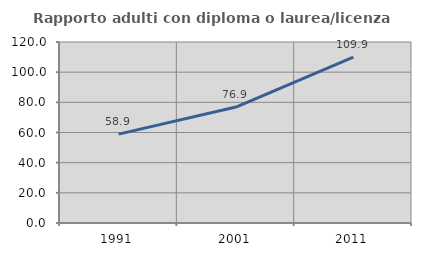
| Category | Rapporto adulti con diploma o laurea/licenza media  |
|---|---|
| 1991.0 | 58.915 |
| 2001.0 | 76.86 |
| 2011.0 | 109.91 |